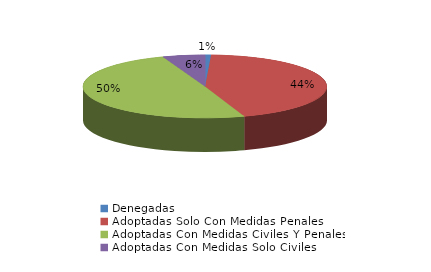
| Category | Series 0 |
|---|---|
| Denegadas | 1 |
| Adoptadas Solo Con Medidas Penales | 55 |
| Adoptadas Con Medidas Civiles Y Penales | 62 |
| Adoptadas Con Medidas Solo Civiles | 7 |